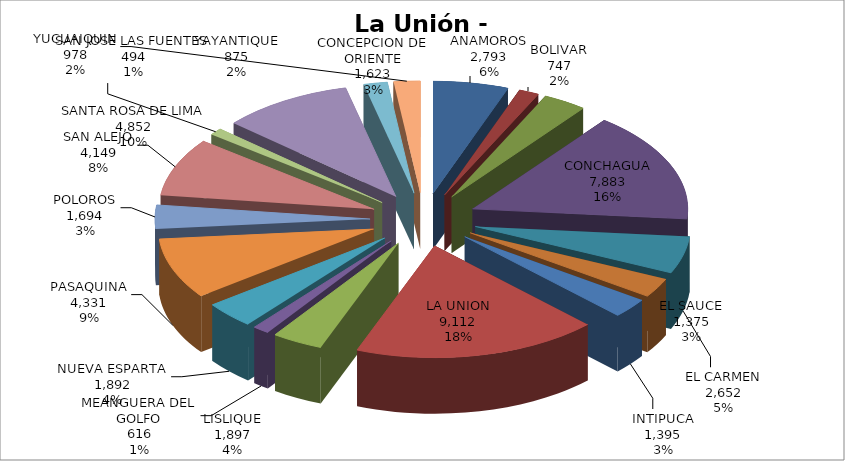
| Category | Series 0 |
|---|---|
| ANAMOROS | 2793 |
| BOLIVAR | 747 |
| CONCEPCION DE ORIENTE | 1623 |
| CONCHAGUA | 7883 |
| EL CARMEN | 2652 |
| EL SAUCE | 1375 |
| INTIPUCA | 1395 |
| LA UNION | 9112 |
| LISLIQUE | 1897 |
| MEANGUERA DEL GOLFO | 616 |
| NUEVA ESPARTA | 1892 |
| PASAQUINA | 4331 |
| POLOROS | 1694 |
| SAN ALEJO | 4149 |
| SAN JOSE LAS FUENTES | 494 |
| SANTA ROSA DE LIMA | 4852 |
| YAYANTIQUE | 875 |
| YUCUAIQUIN | 978 |